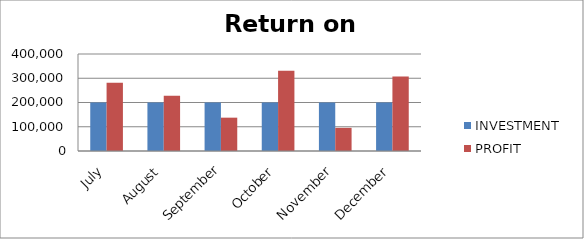
| Category | INVESTMENT  | PROFIT |
|---|---|---|
| July | 200000 | 281355 |
| August | 200000 | 227461 |
| September | 200000 | 137443 |
| October | 200000 | 330928 |
| November | 200000 | 95450 |
| December | 200000 | 307582 |